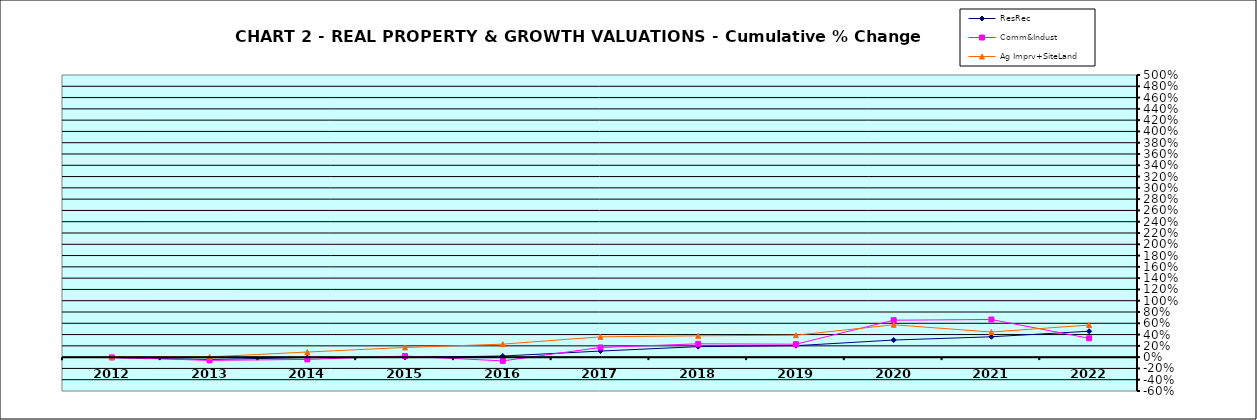
| Category | ResRec | Comm&Indust | Ag Imprv+SiteLand |
|---|---|---|---|
| 2012.0 | -0.009 | -0.005 | 0 |
| 2013.0 | -0.042 | -0.057 | 0.006 |
| 2014.0 | -0.008 | -0.04 | 0.09 |
| 2015.0 | -0.005 | 0.019 | 0.172 |
| 2016.0 | 0.02 | -0.067 | 0.23 |
| 2017.0 | 0.108 | 0.172 | 0.36 |
| 2018.0 | 0.186 | 0.236 | 0.378 |
| 2019.0 | 0.203 | 0.23 | 0.389 |
| 2020.0 | 0.303 | 0.655 | 0.574 |
| 2021.0 | 0.361 | 0.667 | 0.445 |
| 2022.0 | 0.459 | 0.334 | 0.569 |